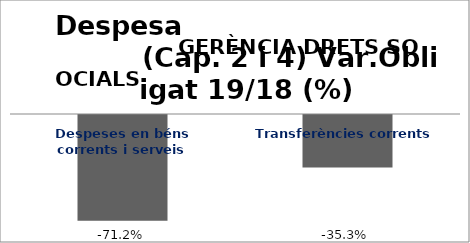
| Category | Series 0 |
|---|---|
| Despeses en béns corrents i serveis | -0.712 |
| Transferències corrents | -0.353 |